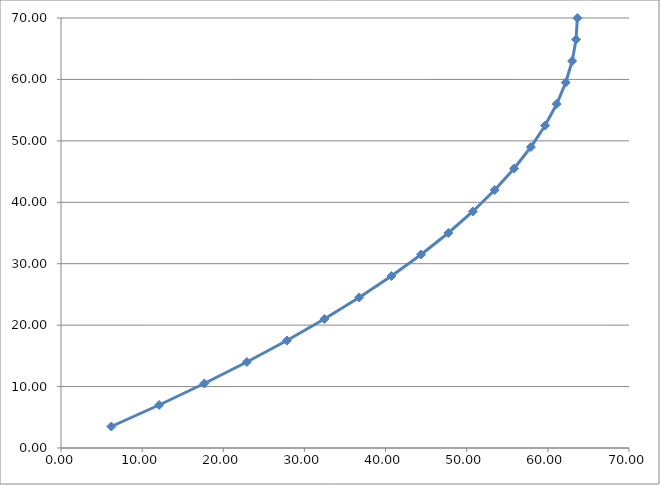
| Category | Series 0 |
|---|---|
| 6.204545454545455 | 3.5 |
| 12.09090909090909 | 7 |
| 17.65909090909091 | 10.5 |
| 22.90909090909091 | 14 |
| 27.84090909090909 | 17.5 |
| 32.45454545454545 | 21 |
| 36.75 | 24.5 |
| 40.72727272727273 | 28 |
| 44.38636363636364 | 31.5 |
| 47.72727272727273 | 35 |
| 50.75 | 38.5 |
| 53.454545454545446 | 42 |
| 55.8409090909091 | 45.5 |
| 57.909090909090914 | 49 |
| 59.65909090909091 | 52.5 |
| 61.090909090909086 | 56 |
| 62.20454545454545 | 59.5 |
| 63.00000000000001 | 63 |
| 63.47727272727273 | 66.5 |
| 63.63636363636363 | 70 |